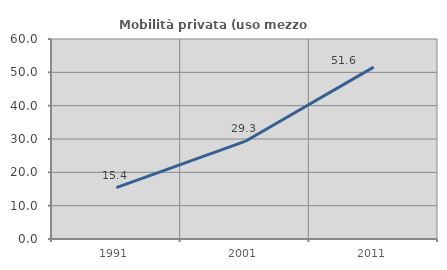
| Category | Mobilità privata (uso mezzo privato) |
|---|---|
| 1991.0 | 15.426 |
| 2001.0 | 29.268 |
| 2011.0 | 51.562 |